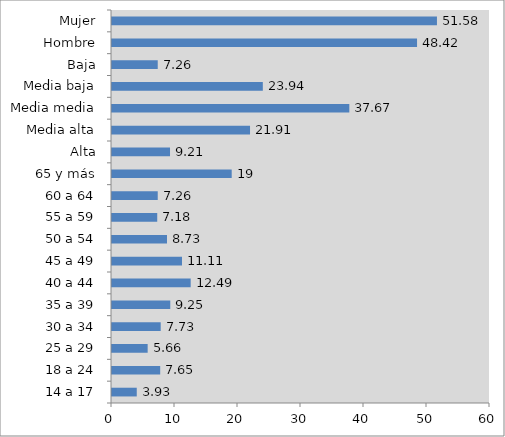
| Category | Series 0 |
|---|---|
| 14 a 17 | 3.93 |
| 18 a 24 | 7.65 |
| 25 a 29 | 5.66 |
| 30 a 34 | 7.73 |
| 35 a 39 | 9.25 |
| 40 a 44 | 12.49 |
| 45 a 49 | 11.11 |
| 50 a 54 | 8.73 |
| 55 a 59 | 7.18 |
| 60 a 64 | 7.26 |
| 65 y más | 19 |
| Alta | 9.21 |
| Media alta | 21.91 |
| Media media | 37.67 |
| Media baja | 23.94 |
| Baja | 7.26 |
| Hombre | 48.42 |
| Mujer | 51.58 |